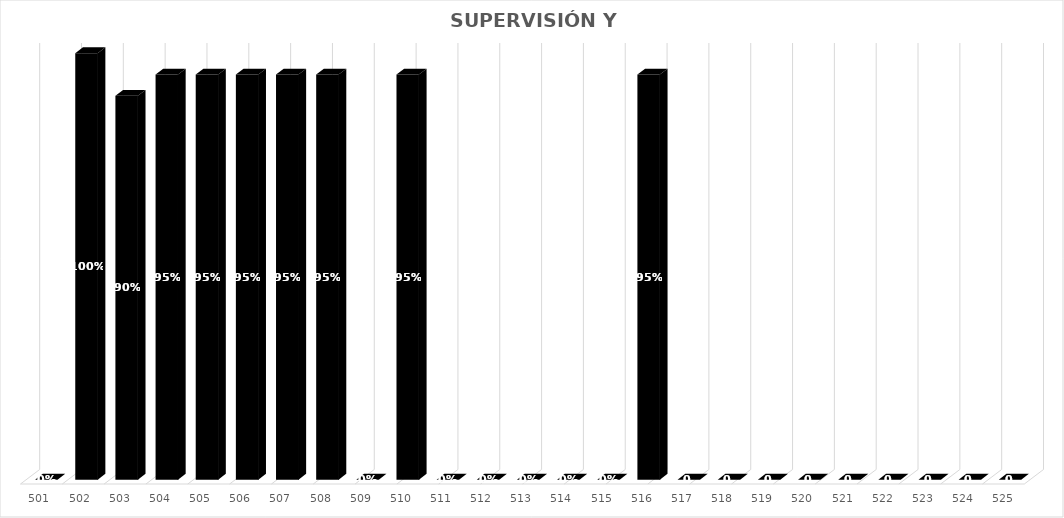
| Category | % Avance |
|---|---|
| 501.0 | 0 |
| 502.0 | 1 |
| 503.0 | 0.9 |
| 504.0 | 0.95 |
| 505.0 | 0.95 |
| 506.0 | 0.95 |
| 507.0 | 0.95 |
| 508.0 | 0.95 |
| 509.0 | 0 |
| 510.0 | 0.95 |
| 511.0 | 0 |
| 512.0 | 0 |
| 513.0 | 0 |
| 514.0 | 0 |
| 515.0 | 0 |
| 516.0 | 0.95 |
| 517.0 | 0 |
| 518.0 | 0 |
| 519.0 | 0 |
| 520.0 | 0 |
| 521.0 | 0 |
| 522.0 | 0 |
| 523.0 | 0 |
| 524.0 | 0 |
| 525.0 | 0 |